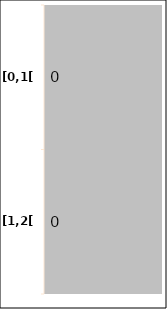
| Category | Series 1 |
|---|---|
| [0,1[ | 0 |
| [1,2[ | 0 |